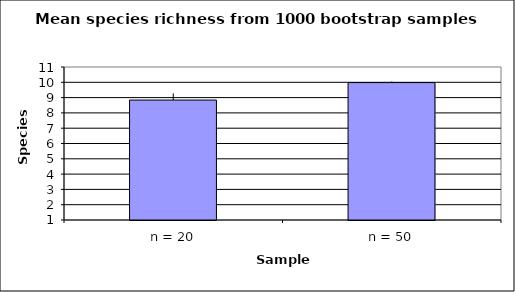
| Category | Series 0 |
|---|---|
| 0 | 8.84 |
| 1 | 9.98 |